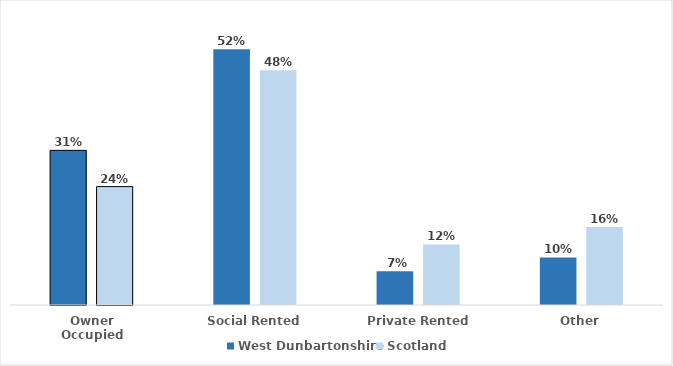
| Category | West Dunbartonshire | Scotland |
|---|---|---|
| Owner Occupied | 0.315 | 0.241 |
| Social Rented | 0.52 | 0.477 |
| Private Rented | 0.068 | 0.123 |
| Other | 0.097 | 0.159 |